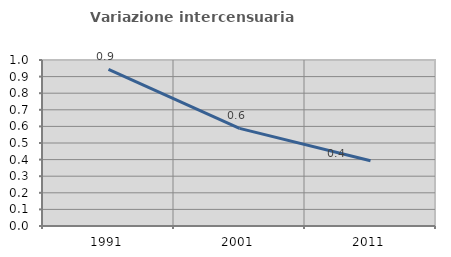
| Category | Variazione intercensuaria annua |
|---|---|
| 1991.0 | 0.944 |
| 2001.0 | 0.588 |
| 2011.0 | 0.393 |